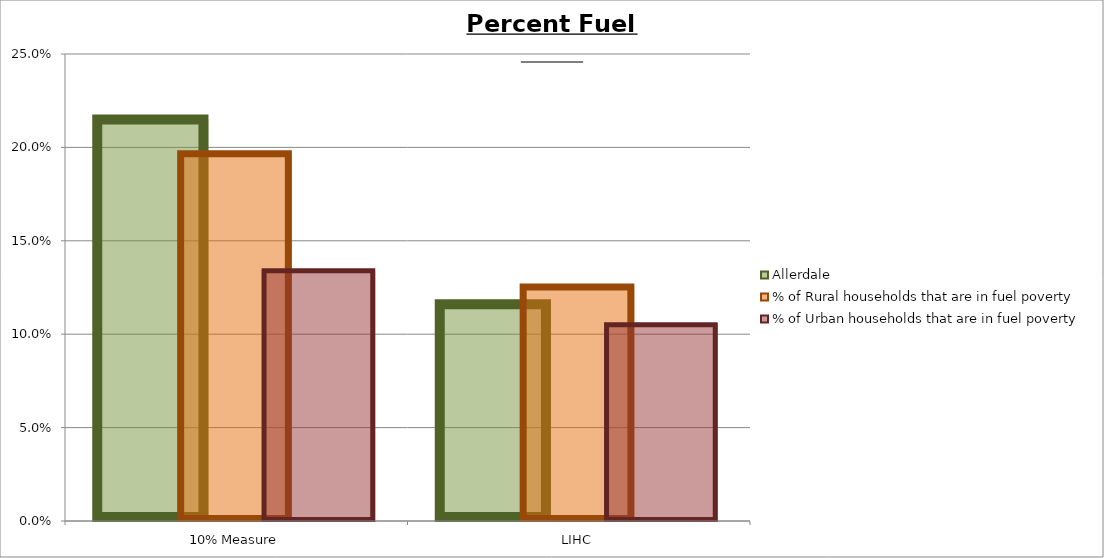
| Category | Allerdale | % of Rural households that are in fuel poverty | % of Urban households that are in fuel poverty |
|---|---|---|---|
| 10% Measure | 0.215 | 0.197 | 0.134 |
| LIHC | 0.116 | 0.125 | 0.105 |